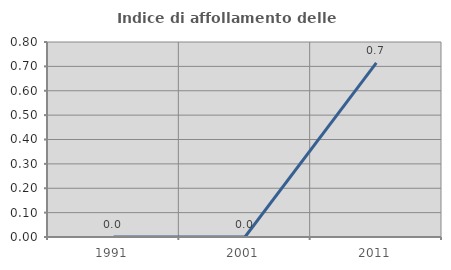
| Category | Indice di affollamento delle abitazioni  |
|---|---|
| 1991.0 | 0 |
| 2001.0 | 0 |
| 2011.0 | 0.714 |